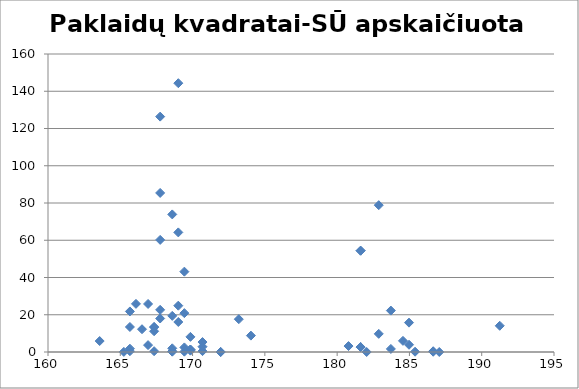
| Category | Paklaid7 kvadratai-S8 apskai2iuota reik6m4 |
|---|---|
| 169.85043239272434 | 1.322 |
| 167.33976935272977 | 0.436 |
| 165.66599399273343 | 13.44 |
| 166.08443783273253 | 25.852 |
| 169.01354471272617 | 64.217 |
| 169.43198855272527 | 20.867 |
| 167.75821319272887 | 60.19 |
| 183.71591415111195 | 1.649 |
| 182.0421387911156 | 0.002 |
| 182.87902647111375 | 78.837 |
| 168.59510087272707 | 0.164 |
| 168.59510087272707 | 1.974 |
| 166.5028816727316 | 12.23 |
| 167.75821319272887 | 17.993 |
| 163.57377479273794 | 5.887 |
| 168.59510087272707 | 0.354 |
| 166.92132551273068 | 3.691 |
| 167.75821319272887 | 22.641 |
| 174.03487079271525 | 8.792 |
| 169.43198855272527 | 43.139 |
| 171.9426515927198 | 0.003 |
| 166.92132551273068 | 25.793 |
| 165.24755015273433 | 0.061 |
| 170.6873200727225 | 2.847 |
| 168.59510087272707 | 19.403 |
| 171.9426515927198 | 0.003 |
| 169.43198855272527 | 2.459 |
| 165.66599399273343 | 1.78 |
| 184.97124567110924 | 3.886 |
| 169.01354471272617 | 16.109 |
| 169.85043239272434 | 8.125 |
| 168.59510087272707 | 73.876 |
| 173.19798311271708 | 17.623 |
| 181.6236949511165 | 2.636 |
| 184.97124567110924 | 15.771 |
| 180.7868072711183 | 3.193 |
| 182.87902647111375 | 9.74 |
| 181.6236949511165 | 54.41 |
| 181.6236949511165 | 2.636 |
| 191.24790327109562 | 14.078 |
| 186.64502103110559 | 0.126 |
| 167.75821319272887 | 126.378 |
| 169.85043239272434 | 0.723 |
| 169.85043239272434 | 1.322 |
| 169.01354471272617 | 24.865 |
| 165.66599399273343 | 21.771 |
| 187.06346487110469 | 0.004 |
| 184.55280183111014 | 5.989 |
| 183.71591415111195 | 22.24 |
| 185.38968951110834 | 0.152 |
| 167.33976935272977 | 13.397 |
| 169.01354471272617 | 144.325 |
| 186.64502103110559 | 0.416 |
| 165.66599399273343 | 0.444 |
| 170.6873200727225 | 5.348 |
| 167.75821319272887 | 85.411 |
| 170.6873200727225 | 0.472 |
| 168.59510087272707 | 0.354 |
| 169.43198855272527 | 0.187 |
| 167.33976935272977 | 13.397 |
| 181.6236949511165 | 54.41 |
| 167.33976935272977 | 11.154 |